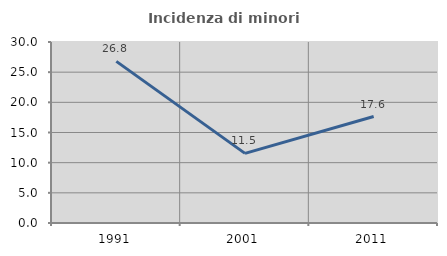
| Category | Incidenza di minori stranieri |
|---|---|
| 1991.0 | 26.786 |
| 2001.0 | 11.538 |
| 2011.0 | 17.647 |